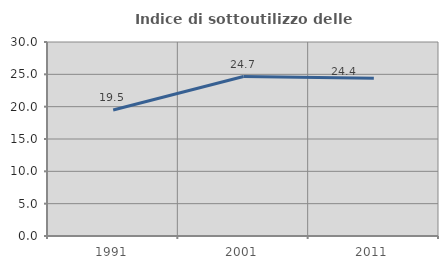
| Category | Indice di sottoutilizzo delle abitazioni  |
|---|---|
| 1991.0 | 19.492 |
| 2001.0 | 24.663 |
| 2011.0 | 24.398 |